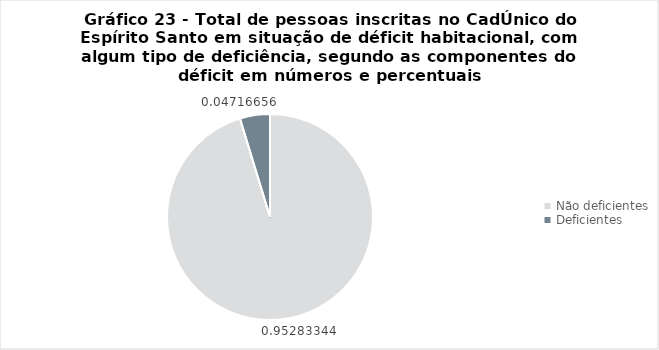
| Category | Series 0 |
|---|---|
| Não deficientes | 0.953 |
| Deficientes | 0.047 |